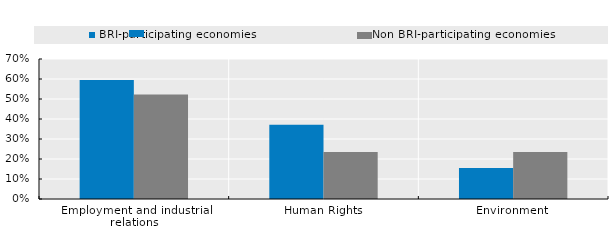
| Category | BRI-participating economies | Non BRI-participating economies |
|---|---|---|
| Employment and industrial relations | 0.595 | 0.522 |
| Human Rights | 0.372 | 0.235 |
| Environment  | 0.155 | 0.235 |